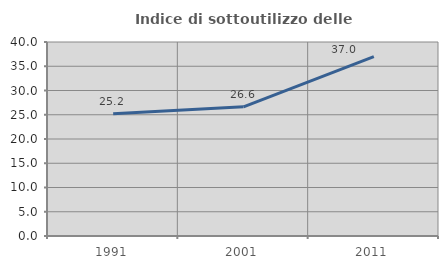
| Category | Indice di sottoutilizzo delle abitazioni  |
|---|---|
| 1991.0 | 25.187 |
| 2001.0 | 26.642 |
| 2011.0 | 36.997 |